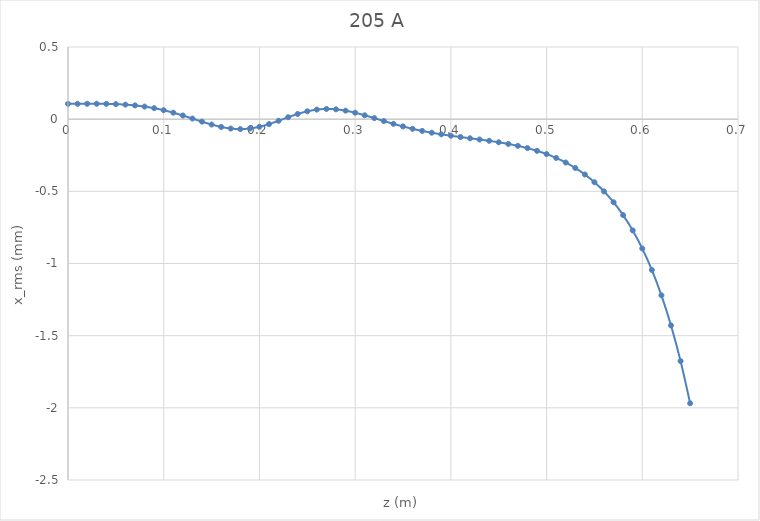
| Category | Series 0 |
|---|---|
| 0.0 | 0.106 |
| 0.01 | 0.106 |
| 0.02 | 0.106 |
| 0.03 | 0.106 |
| 0.04 | 0.106 |
| 0.05 | 0.104 |
| 0.06 | 0.101 |
| 0.07 | 0.095 |
| 0.08 | 0.087 |
| 0.09 | 0.076 |
| 0.1 | 0.062 |
| 0.11 | 0.045 |
| 0.12 | 0.025 |
| 0.13 | 0.004 |
| 0.14 | -0.017 |
| 0.15 | -0.037 |
| 0.16 | -0.054 |
| 0.17 | -0.065 |
| 0.18 | -0.069 |
| 0.19 | -0.065 |
| 0.2 | -0.053 |
| 0.21 | -0.034 |
| 0.22 | -0.011 |
| 0.23 | 0.013 |
| 0.24 | 0.036 |
| 0.25 | 0.054 |
| 0.26 | 0.066 |
| 0.27 | 0.071 |
| 0.28 | 0.068 |
| 0.29 | 0.059 |
| 0.3 | 0.045 |
| 0.31 | 0.027 |
| 0.32 | 0.007 |
| 0.33 | -0.013 |
| 0.34 | -0.032 |
| 0.35 | -0.051 |
| 0.36 | -0.067 |
| 0.37 | -0.081 |
| 0.38 | -0.094 |
| 0.39 | -0.105 |
| 0.4 | -0.115 |
| 0.41 | -0.124 |
| 0.42 | -0.132 |
| 0.43 | -0.141 |
| 0.44 | -0.15 |
| 0.45 | -0.16 |
| 0.46 | -0.171 |
| 0.47 | -0.185 |
| 0.48 | -0.201 |
| 0.49 | -0.219 |
| 0.5 | -0.242 |
| 0.51 | -0.268 |
| 0.52 | -0.3 |
| 0.53 | -0.338 |
| 0.54 | -0.383 |
| 0.55 | -0.437 |
| 0.56 | -0.5 |
| 0.57 | -0.576 |
| 0.58 | -0.665 |
| 0.59 | -0.771 |
| 0.6 | -0.896 |
| 0.61 | -1.045 |
| 0.62 | -1.221 |
| 0.63 | -1.429 |
| 0.64 | -1.676 |
| 0.65 | -1.968 |